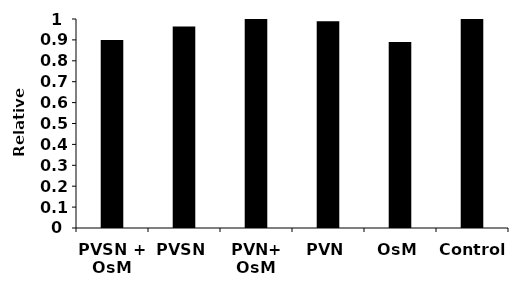
| Category | Series 0 |
|---|---|
| PVSN + OsM | 0.9 |
| PVSN | 0.964 |
| PVN+ OsM | 1.078 |
| PVN | 0.989 |
| OsM | 0.89 |
| Control | 1 |